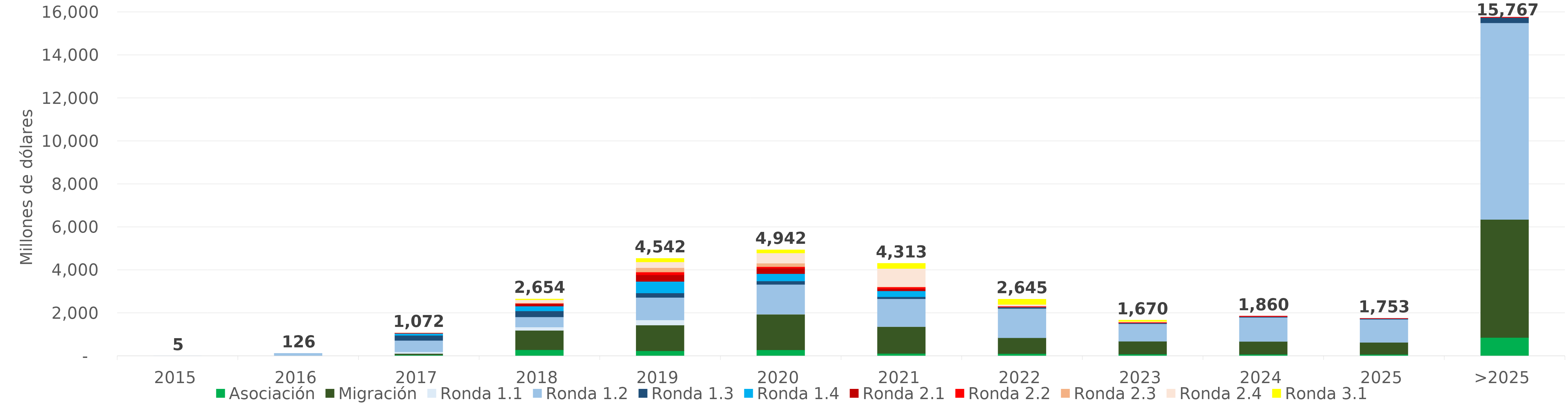
| Category | Asociación | Migración | Ronda 1.1 | Ronda 1.2 | Ronda 1.3 | Ronda 1.4 | Ronda 2.1 | Ronda 2.2 | Ronda 2.3 | Ronda 2.4 | Ronda 3.1 |
|---|---|---|---|---|---|---|---|---|---|---|---|
| 2015 | 0 | 0 | 4.573 | 0.236 | 0 | 0 | 0 | 0 | 0 | 0 | 0 |
| 2016 | 0 | 0 | 16.79 | 108.909 | 0 | 0 | 0 | 0 | 0 | 0 | 0 |
| 2017 | 50.877 | 65.422 | 76.429 | 533.486 | 231.789 | 93.443 | 18.851 | 1.29 | 0.72 | 0 | 0 |
| 2018 | 289.394 | 902.921 | 155.042 | 470.128 | 278.302 | 226.903 | 104.896 | 21.902 | 26.974 | 139.641 | 37.691 |
| 2019 | 241.207 | 1195.818 | 236.68 | 1049.68 | 207.126 | 540.649 | 302.09 | 133.009 | 199.161 | 270.262 | 166.186 |
| 2020 | 284.321 | 1655.641 | 6.736 | 1382.287 | 161.213 | 341.057 | 252.645 | 69.974 | 162.648 | 477.469 | 148.013 |
| 2021 | 118.804 | 1248.14 | 2.229 | 1293.069 | 92.463 | 274.593 | 98.126 | 80.805 | 14.623 | 847.746 | 242.801 |
| 2022 | 112.591 | 734.125 | 0 | 1363.556 | 44.141 | 10.69 | 22.683 | 30.043 | 0 | 82.428 | 244.664 |
| 2023 | 87.085 | 598.009 | 0 | 815.124 | 38.135 | 0.73 | 0.019 | 36.282 | 0 | 32.499 | 62.088 |
| 2024 | 79.455 | 599.59 | 0 | 1120.717 | 33.996 | 0 | 0 | 26.685 | 0 | 0 | 0 |
| 2025 | 75.288 | 558.545 | 0 | 1074.435 | 35.345 | 0 | 0 | 9.414 | 0 | 0 | 0 |
| >2025 | 859.226 | 5491.405 | 0 | 9146.402 | 249.076 | 0 | 0 | 21.146 | 0 | 0 | 0 |